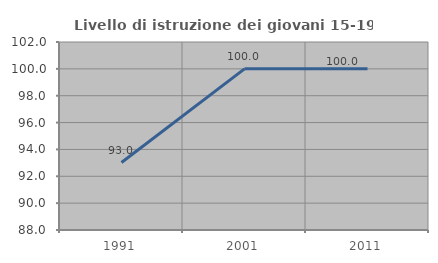
| Category | Livello di istruzione dei giovani 15-19 anni |
|---|---|
| 1991.0 | 93.023 |
| 2001.0 | 100 |
| 2011.0 | 100 |